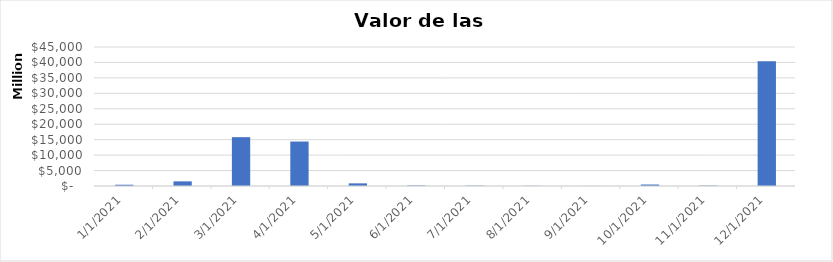
| Category | Valor Importaciones (COP) |
|---|---|
| 1/1/21 | 411891355.82 |
| 2/1/21 | 1502752090.162 |
| 3/1/21 | 15811737724.93 |
| 4/1/21 | 14393798154.474 |
| 5/1/21 | 852578516.433 |
| 6/1/21 | 168850013.739 |
| 7/1/21 | 112033367.551 |
| 8/1/21 | 60872525.692 |
| 9/1/21 | 17958435.529 |
| 10/1/21 | 483216910.665 |
| 11/1/21 | 131133282.601 |
| 12/1/21 | 40400338931.625 |